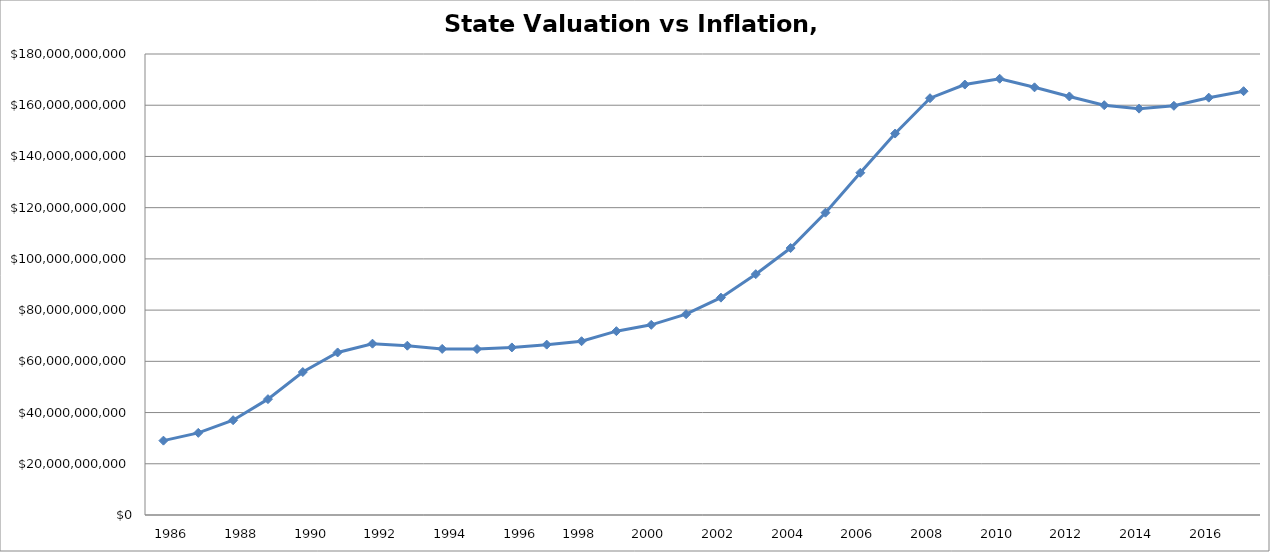
| Category | State Valuation |
|---|---|
|       1986 | 29029700000 |
|       1987 | 32075350000 |
|       1988 | 37019250000 |
|       1989 | 45234800000 |
|       1990 | 55821300000 |
|       1991 | 63462900000 |
|       1992 | 66895050000 |
|       1993 | 66107653510 |
|       1994 | 64848250000 |
|       1995 | 64802300000 |
|       1996 | 65427025900 |
| 1997 | 66521100000 |
| 1998 | 67853850000 |
| 1999 | 71779350000 |
| 2000 | 74253100000 |
| 2001 | 78405400000 |
| 2002 | 84867750000 |
| 2003 | 94034450000 |
| 2004 | 104237050000 |
| 2005 | 118040420000 |
| 2006 | 133628600000 |
| 2007 | 148946200000 |
| 2008 | 162732200000 |
| 2009 | 168071150000 |
| 2010 | 170336350000 |
| 2011 | 166990700000 |
| 2012 | 163424200000 |
| 2013 | 160011900000 |
| 2014 | 158661600000 |
| 2015 | 159770050000 |
| 2016 | 162950100000 |
| 2017 | 165485750000 |